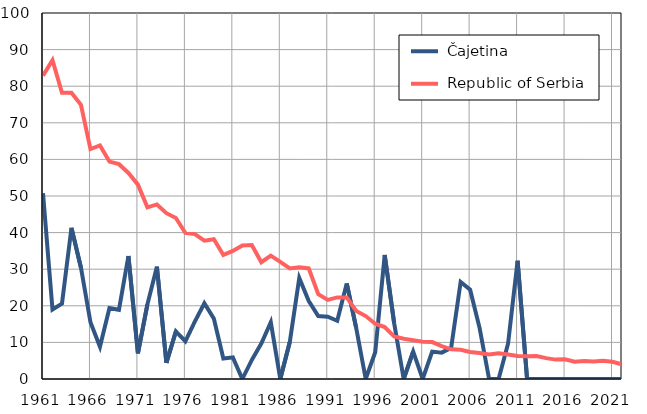
| Category |  Čajetina |  Republic of Serbia |
|---|---|---|
| 1961.0 | 50.8 | 82.9 |
| 1962.0 | 19 | 87.1 |
| 1963.0 | 20.6 | 78.2 |
| 1964.0 | 41.3 | 78.2 |
| 1965.0 | 30.4 | 74.9 |
| 1966.0 | 15.5 | 62.8 |
| 1967.0 | 8.8 | 63.8 |
| 1968.0 | 19.4 | 59.4 |
| 1969.0 | 18.9 | 58.7 |
| 1970.0 | 33.6 | 56.3 |
| 1971.0 | 7 | 53.1 |
| 1972.0 | 20.4 | 46.9 |
| 1973.0 | 30.7 | 47.7 |
| 1974.0 | 4.4 | 45.3 |
| 1975.0 | 13 | 44 |
| 1976.0 | 10.3 | 39.9 |
| 1977.0 | 15.7 | 39.6 |
| 1978.0 | 20.7 | 37.8 |
| 1979.0 | 16.5 | 38.2 |
| 1980.0 | 5.6 | 33.9 |
| 1981.0 | 5.9 | 35 |
| 1982.0 | 0 | 36.5 |
| 1983.0 | 5.2 | 36.6 |
| 1984.0 | 9.7 | 31.9 |
| 1985.0 | 15.5 | 33.7 |
| 1986.0 | 0 | 32 |
| 1987.0 | 10.1 | 30.2 |
| 1988.0 | 27.6 | 30.5 |
| 1989.0 | 21.3 | 30.2 |
| 1990.0 | 17.2 | 23.2 |
| 1991.0 | 17 | 21.6 |
| 1992.0 | 15.9 | 22.3 |
| 1993.0 | 26.1 | 22.3 |
| 1994.0 | 13.9 | 18.6 |
| 1995.0 | 0 | 17.2 |
| 1996.0 | 7.3 | 15.1 |
| 1997.0 | 33.9 | 14.2 |
| 1998.0 | 15.2 | 11.6 |
| 1999.0 | 0 | 11 |
| 2000.0 | 7.5 | 10.6 |
| 2001.0 | 0 | 10.2 |
| 2002.0 | 7.5 | 10.1 |
| 2003.0 | 7.2 | 9 |
| 2004.0 | 8.5 | 8.1 |
| 2005.0 | 26.5 | 8 |
| 2006.0 | 24.4 | 7.4 |
| 2007.0 | 13.9 | 7.1 |
| 2008.0 | 0 | 6.7 |
| 2009.0 | 0 | 7 |
| 2010.0 | 9.7 | 6.7 |
| 2011.0 | 32.3 | 6.3 |
| 2012.0 | 0 | 6.2 |
| 2013.0 | 0 | 6.3 |
| 2014.0 | 0 | 5.7 |
| 2015.0 | 0 | 5.3 |
| 2016.0 | 0 | 5.4 |
| 2017.0 | 0 | 4.7 |
| 2018.0 | 0 | 4.9 |
| 2019.0 | 0 | 4.8 |
| 2020.0 | 0 | 5 |
| 2021.0 | 0 | 4.7 |
| 2022.0 | 0 | 4 |